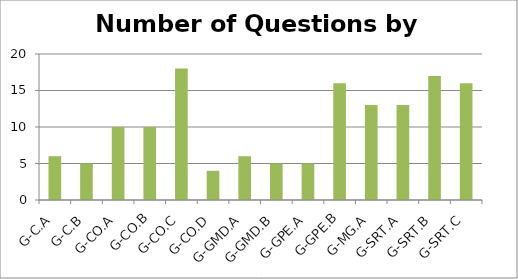
| Category | Number of Questions |
|---|---|
| G-C.A | 6 |
| G-C.B | 5 |
| G-CO.A | 10 |
| G-CO.B | 10 |
| G-CO.C | 18 |
| G-CO.D | 4 |
| G-GMD.A | 6 |
| G-GMD.B | 5 |
| G-GPE.A | 5 |
| G-GPE.B | 16 |
| G-MG.A | 13 |
| G-SRT.A | 13 |
| G-SRT.B | 17 |
| G-SRT.C | 16 |